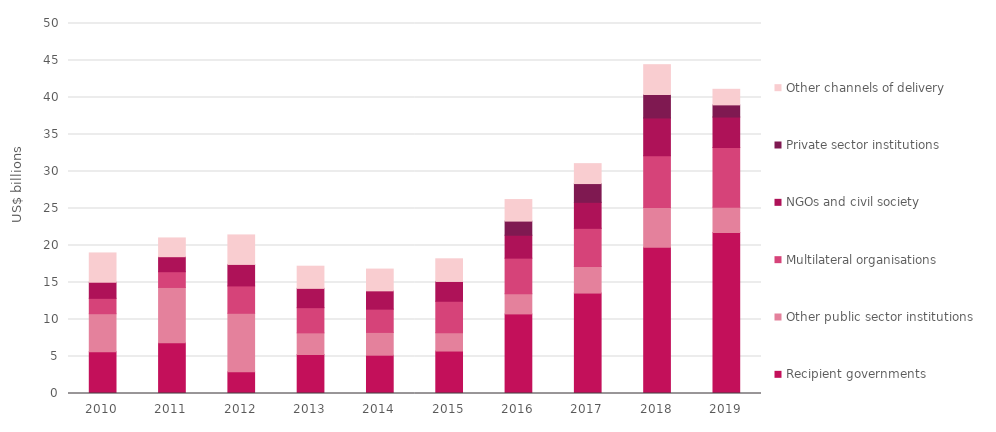
| Category | Recipient governments | Other public sector institutions | Multilateral organisations | NGOs and civil society | Private sector institutions | Other channels of delivery |
|---|---|---|---|---|---|---|
| 2010.0 | 5.657 | 5.125 | 2.077 | 2.178 | 0 | 3.957 |
| 2011.0 | 6.861 | 7.469 | 2.127 | 2.029 | 0 | 2.536 |
| 2012.0 | 2.925 | 7.913 | 3.699 | 2.907 | 0 | 3.986 |
| 2013.0 | 5.272 | 2.923 | 3.404 | 2.61 | 0 | 2.992 |
| 2014.0 | 5.177 | 3.076 | 3.146 | 2.475 | 0 | 2.941 |
| 2015.0 | 5.738 | 2.481 | 4.246 | 2.677 | 0 | 3.062 |
| 2016.0 | 10.756 | 2.728 | 4.808 | 3.095 | 1.912 | 2.911 |
| 2017.0 | 13.571 | 3.6 | 5.147 | 3.516 | 2.534 | 2.691 |
| 2018.0 | 19.761 | 5.384 | 6.967 | 5.123 | 3.174 | 4.026 |
| 2019.0 | 21.76 | 3.424 | 8.057 | 4.117 | 1.646 | 2.103 |